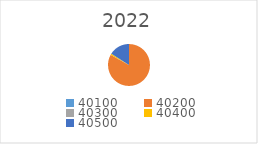
| Category | Series 0 |
|---|---|
| 40100.0 | 0 |
| 40200.0 | 962543.3 |
| 40300.0 | 0 |
| 40400.0 | 11708.44 |
| 40500.0 | 184916.39 |